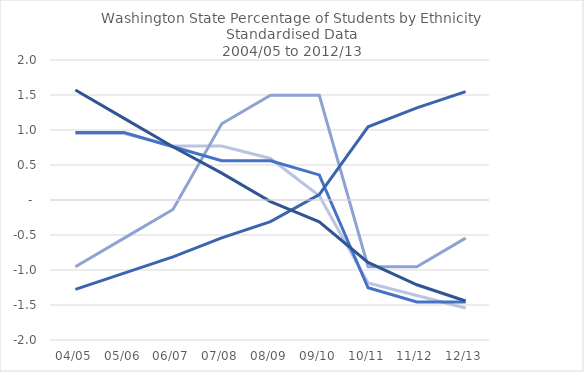
| Category | American Indian | Asian | Black | Hispanic | White |
|---|---|---|---|---|---|
| 04/05 | 0.949 | -0.953 | 0.963 | -1.277 | 1.572 |
| 05/06 | 0.949 | -0.544 | 0.963 | -1.045 | 1.166 |
| 06/07 | 0.771 | -0.136 | 0.761 | -0.813 | 0.76 |
| 07/08 | 0.771 | 1.089 | 0.56 | -0.542 | 0.383 |
| 08/09 | 0.593 | 1.497 | 0.56 | -0.31 | -0.023 |
| 09/10 | 0.059 | 1.497 | 0.358 | 0.077 | -0.312 |
| 10/11 | -1.187 | -0.953 | -1.254 | 1.045 | -0.892 |
| 11/12 | -1.365 | -0.953 | -1.456 | 1.316 | -1.211 |
| 12/13 | -1.543 | -0.544 | -1.456 | 1.548 | -1.443 |